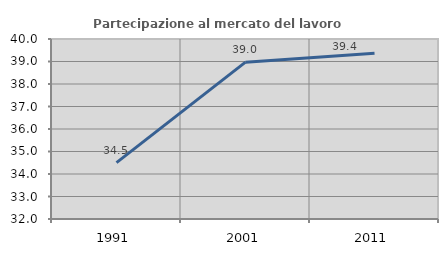
| Category | Partecipazione al mercato del lavoro  femminile |
|---|---|
| 1991.0 | 34.507 |
| 2001.0 | 38.971 |
| 2011.0 | 39.37 |